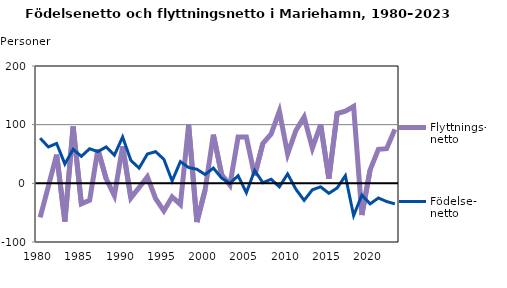
| Category | Flyttnings- netto | Födelse- netto |
|---|---|---|
| 1980.0 | -58 | 77 |
| 1981.0 | -5 | 62 |
| 1982.0 | 49 | 68 |
| 1983.0 | -65 | 33 |
| 1984.0 | 97 | 58 |
| 1985.0 | -35 | 46 |
| 1986.0 | -29 | 59 |
| 1987.0 | 58 | 54 |
| 1988.0 | 8 | 62 |
| 1989.0 | -21 | 48 |
| 1990.0 | 63 | 79 |
| 1991.0 | -25 | 39 |
| 1992.0 | -7 | 26 |
| 1993.0 | 11 | 50 |
| 1994.0 | -26 | 54 |
| 1995.0 | -47 | 41 |
| 1996.0 | -23 | 4 |
| 1997.0 | -36 | 37 |
| 1998.0 | 100 | 27 |
| 1999.0 | -66 | 24 |
| 2000.0 | -11 | 15 |
| 2001.0 | 83 | 26 |
| 2002.0 | 15 | 9 |
| 2003.0 | -3 | 0 |
| 2004.0 | 79 | 13 |
| 2005.0 | 79 | -16 |
| 2006.0 | 13 | 22 |
| 2007.0 | 68 | 1 |
| 2008.0 | 84 | 7 |
| 2009.0 | 123 | -6 |
| 2010.0 | 50 | 16 |
| 2011.0 | 90 | -10 |
| 2012.0 | 113 | -29 |
| 2013.0 | 60 | -11 |
| 2014.0 | 100 | -6 |
| 2015.0 | 8 | -17 |
| 2016.0 | 119 | -8 |
| 2017.0 | 123 | 13 |
| 2018.0 | 131 | -55 |
| 2019.0 | -54 | -20 |
| 2020.0 | 23 | -35 |
| 2021.0 | 58 | -25 |
| 2022.0 | 59 | -31 |
| 2023.0 | 92 | -35 |